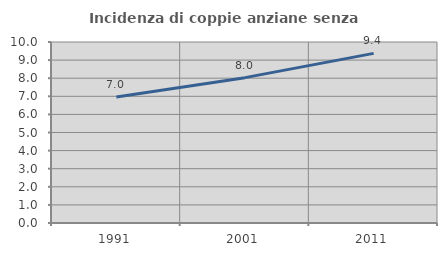
| Category | Incidenza di coppie anziane senza figli  |
|---|---|
| 1991.0 | 6.958 |
| 2001.0 | 8.03 |
| 2011.0 | 9.371 |